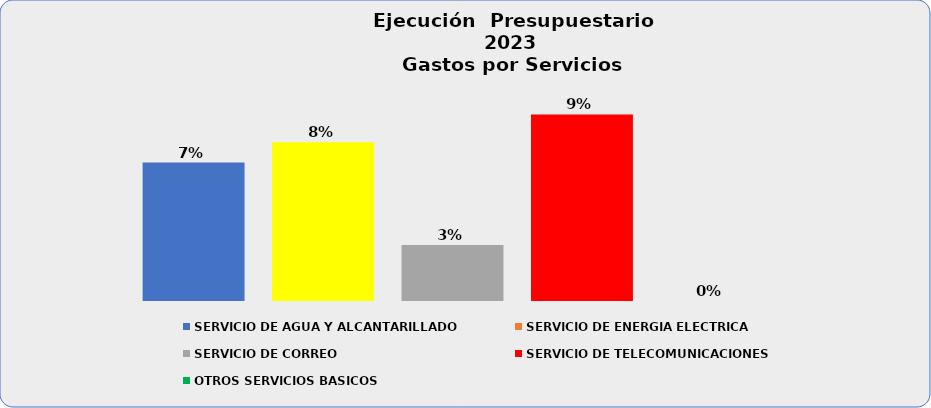
| Category | SERVICIO DE AGUA Y ALCANTARILLADO | SERVICIO DE ENERGIA ELECTRICA | SERVICIO DE CORREO | SERVICIO DE TELECOMUNICACIONES | OTROS SERVICIOS BASICOS |
|---|---|---|---|---|---|
| 0 | 0.066 | 0.076 | 0.027 | 0.089 | 0 |